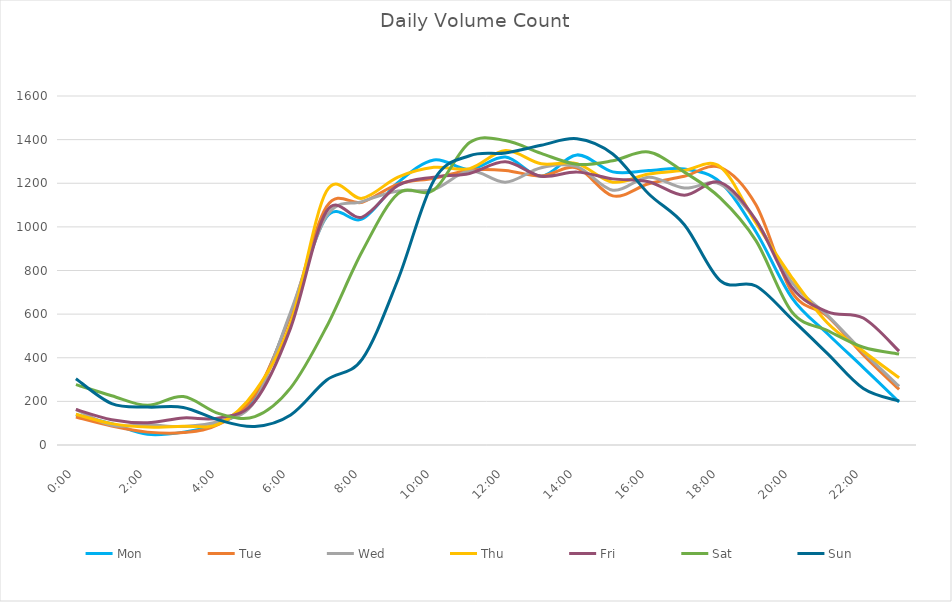
| Category | Mon | Tue | Wed | Thu | Fri | Sat | Sun |
|---|---|---|---|---|---|---|---|
| 0.0 | 139 | 128 | 163 | 141 | 163 | 277 | 304 |
| 0.0416666666666667 | 98 | 87 | 90 | 98 | 116 | 226 | 190 |
| 0.0833333333333333 | 49 | 59 | 93 | 82 | 102 | 182 | 174 |
| 0.125 | 59 | 57 | 85 | 86 | 124 | 222 | 172 |
| 0.166666666666667 | 99 | 95 | 109 | 97 | 124 | 144 | 114 |
| 0.208333333333333 | 217 | 229 | 201 | 245 | 200 | 130 | 85 |
| 0.25 | 600 | 598 | 610 | 560 | 537 | 262 | 138 |
| 0.291666666666667 | 1045 | 1092 | 1049 | 1163 | 1071 | 541 | 297 |
| 0.333333333333333 | 1036 | 1113 | 1116 | 1131 | 1045 | 888 | 394 |
| 0.375 | 1204 | 1196 | 1164 | 1228 | 1190 | 1152 | 759 |
| 0.416666666666667 | 1307 | 1223 | 1172 | 1273 | 1228 | 1169 | 1213 |
| 0.4583333333333333 | 1263 | 1260 | 1257 | 1267 | 1245 | 1387 | 1326 |
| 0.5 | 1320 | 1259 | 1205 | 1350 | 1298 | 1396 | 1339 |
| 0.541666666666667 | 1232 | 1233 | 1271 | 1289 | 1232 | 1337 | 1374 |
| 0.5833333333333334 | 1330 | 1270 | 1276 | 1290 | 1251 | 1287 | 1404 |
| 0.625 | 1252 | 1142 | 1168 | 1205 | 1220 | 1303 | 1334 |
| 0.666666666666667 | 1258 | 1198 | 1228 | 1242 | 1207 | 1343 | 1152 |
| 0.7083333333333334 | 1265 | 1232 | 1178 | 1259 | 1145 | 1251 | 1010 |
| 0.75 | 1205 | 1273 | 1196 | 1276 | 1204 | 1133 | 754 |
| 0.791666666666667 | 978 | 1101 | 1028 | 1018 | 1031 | 937 | 729 |
| 0.8333333333333334 | 676 | 702 | 747 | 769 | 724 | 611 | 577 |
| 0.875 | 510 | 590 | 594 | 559 | 610 | 525 | 419 |
| 0.916666666666667 | 355 | 413 | 426 | 430 | 582 | 448 | 259 |
| 0.9583333333333334 | 197 | 255 | 269 | 308 | 430 | 417 | 201 |